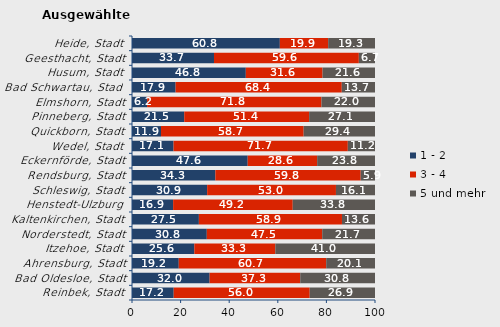
| Category | 1 - 2 | 3 - 4 | 5 und mehr |
|---|---|---|---|
| Reinbek, Stadt | 17.164 | 55.97 | 26.866 |
| Bad Oldesloe, Stadt | 31.953 | 37.278 | 30.769 |
| Ahrensburg, Stadt | 19.247 | 60.669 | 20.084 |
| Itzehoe, Stadt | 25.641 | 33.333 | 41.026 |
| Norderstedt, Stadt | 30.788 | 47.494 | 21.718 |
| Kaltenkirchen, Stadt | 27.526 | 58.885 | 13.589 |
| Henstedt-Ulzburg | 16.923 | 49.231 | 33.846 |
| Schleswig, Stadt | 30.924 | 53.012 | 16.064 |
| Rendsburg, Stadt | 34.314 | 59.804 | 5.882 |
| Eckernförde, Stadt | 47.619 | 28.571 | 23.81 |
| Wedel, Stadt | 17.105 | 71.711 | 11.184 |
| Quickborn, Stadt | 11.94 | 58.706 | 29.353 |
| Pinneberg, Stadt | 21.495 | 51.402 | 27.103 |
| Elmshorn, Stadt | 6.215 | 71.751 | 22.034 |
| Bad Schwartau, Stadt | 17.949 | 68.376 | 13.675 |
| Husum, Stadt | 46.842 | 31.579 | 21.579 |
| Geesthacht, Stadt | 33.744 | 59.606 | 6.65 |
| Heide, Stadt | 60.843 | 19.88 | 19.277 |